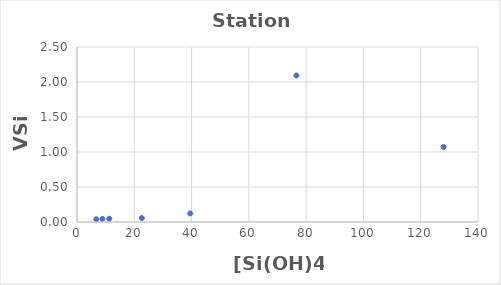
| Category | Series 0 |
|---|---|
| 6.75 | 0.039 |
| 8.8887756376942 | 0.045 |
| 11.2641584344615 | 0.047 |
| 22.6360457123918 | 0.056 |
| 39.5326653812595 | 0.122 |
| 76.6020840154049 | 2.093 |
| 127.98339410952 | 1.072 |